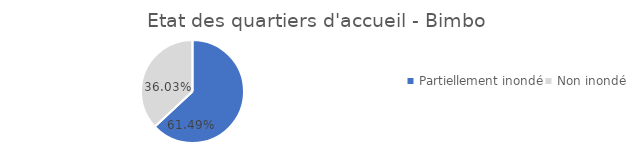
| Category | Individus PDI |
|---|---|
| Partiellement inondé | 0.615 |
| Non inondé | 0.36 |